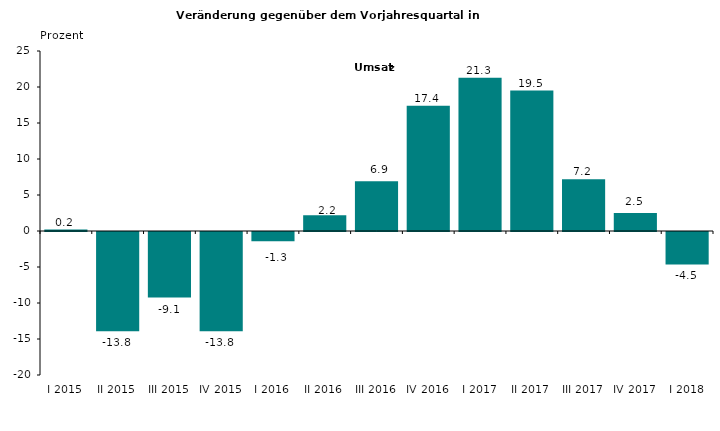
| Category | 0,2 -13,8 -9,1 -13,8 -1,3 2,2 6,9 17,4 21,3 19,5 7,2 2,5 -4,5 |
|---|---|
| I 2015 | 0.2 |
| II 2015 | -13.8 |
| III 2015 | -9.1 |
| IV 2015 | -13.8 |
| I 2016 | -1.3 |
| II 2016 | 2.2 |
| III 2016 | 6.9 |
| IV 2016 | 17.4 |
| I 2017 | 21.3 |
| II 2017 | 19.5 |
| III 2017 | 7.2 |
| IV 2017 | 2.5 |
| I 2018 | -4.5 |